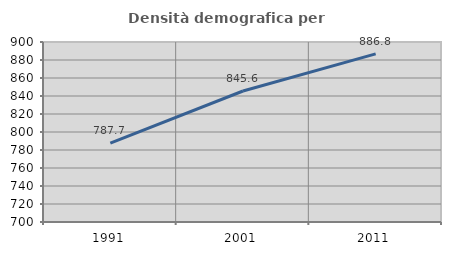
| Category | Densità demografica |
|---|---|
| 1991.0 | 787.664 |
| 2001.0 | 845.571 |
| 2011.0 | 886.83 |